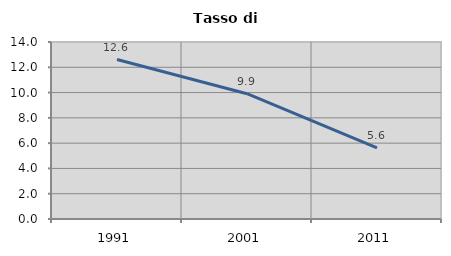
| Category | Tasso di disoccupazione   |
|---|---|
| 1991.0 | 12.615 |
| 2001.0 | 9.913 |
| 2011.0 | 5.634 |